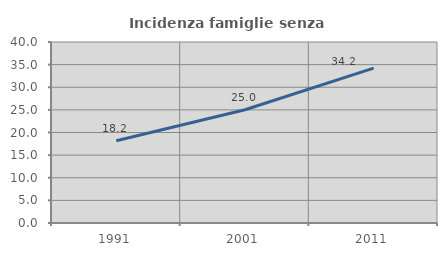
| Category | Incidenza famiglie senza nuclei |
|---|---|
| 1991.0 | 18.195 |
| 2001.0 | 25.036 |
| 2011.0 | 34.225 |